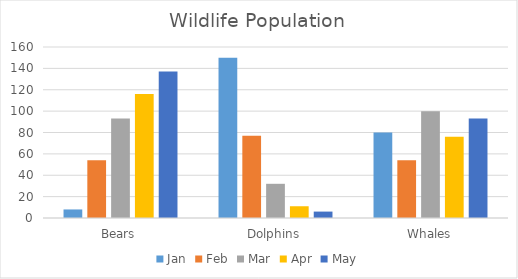
| Category | Jan | Feb | Mar | Apr | May |
|---|---|---|---|---|---|
| Bears | 8 | 54 | 93 | 116 | 137 |
| Dolphins | 150 | 77 | 32 | 11 | 6 |
| Whales | 80 | 54 | 100 | 76 | 93 |